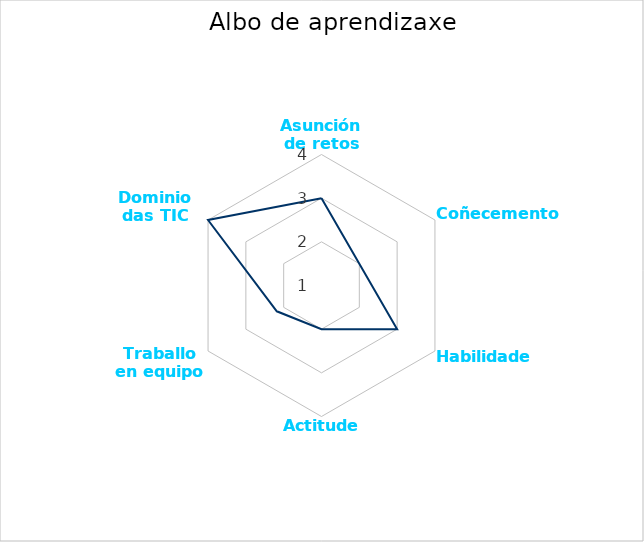
| Category | Media |
|---|---|
| Asunción de retos | 3 |
| Coñecementos | 2 |
| Habilidades | 3 |
| Actitudes | 2 |
| Traballo en equipo | 2.182 |
| Dominio das TIC | 4 |